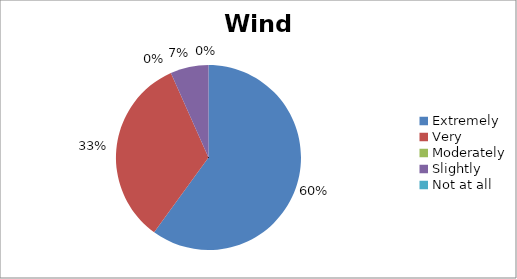
| Category | Wind |
|---|---|
| Extremely | 9 |
| Very | 5 |
| Moderately | 0 |
| Slightly | 1 |
| Not at all | 0 |